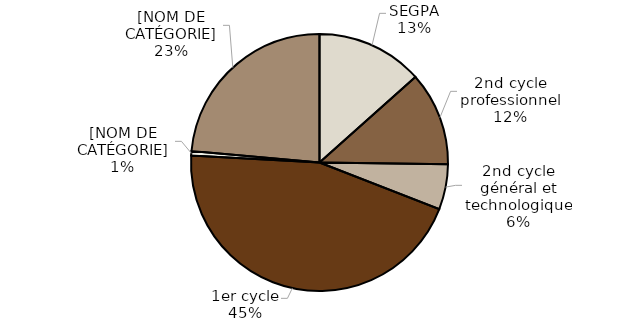
| Category | Series 0 |
|---|---|
| SEGPA | 891 |
| 2nd cycle professionnel | 785 |
| 2nd cycle général et technologique | 377 |
| 1er cycle | 2987 |
| Autre 2nd degré | 37 |
| Niveau 1er degré | 1566 |